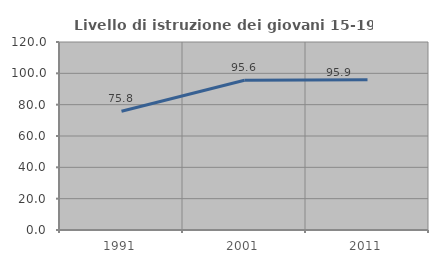
| Category | Livello di istruzione dei giovani 15-19 anni |
|---|---|
| 1991.0 | 75.82 |
| 2001.0 | 95.61 |
| 2011.0 | 95.89 |